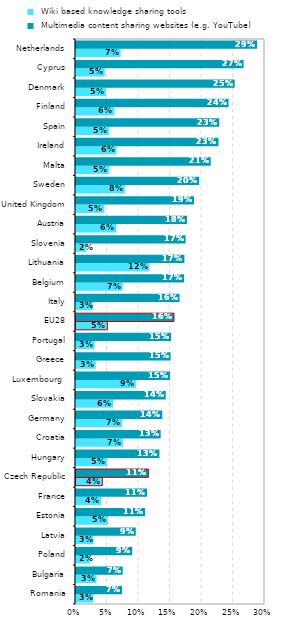
| Category |  Wiki based knowledge sharing tools |  Multimedia content sharing websites (e.g. YouTube) |
|---|---|---|
| Romania | 0.028 | 0.073 |
| Bulgaria | 0.033 | 0.074 |
| Poland | 0.023 | 0.089 |
| Latvia | 0.028 | 0.095 |
| Estonia | 0.051 | 0.11 |
| France | 0.04 | 0.113 |
| Czech Republic | 0.042 | 0.115 |
| Hungary | 0.049 | 0.132 |
| Croatia | 0.075 | 0.134 |
| Germany | 0.073 | 0.137 |
| Slovakia | 0.059 | 0.142 |
| Luxembourg  | 0.095 | 0.149 |
| Greece | 0.031 | 0.15 |
| Portugal | 0.03 | 0.151 |
| EU28 | 0.05 | 0.155 |
| Italy | 0.027 | 0.164 |
| Belgium | 0.074 | 0.172 |
| Lithuania | 0.117 | 0.172 |
| Slovenia | 0.016 | 0.174 |
| Austria | 0.064 | 0.176 |
| United Kingdom | 0.045 | 0.187 |
| Sweden | 0.078 | 0.196 |
| Malta | 0.053 | 0.214 |
| Ireland | 0.064 | 0.226 |
| Spain | 0.052 | 0.227 |
| Finland | 0.061 | 0.242 |
| Denmark | 0.048 | 0.252 |
| Cyprus | 0.046 | 0.266 |
| Netherlands | 0.071 | 0.288 |